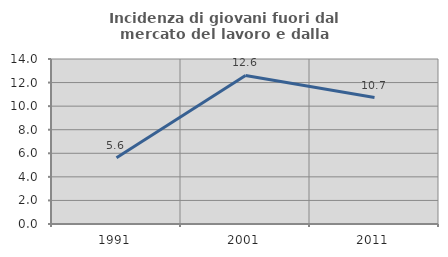
| Category | Incidenza di giovani fuori dal mercato del lavoro e dalla formazione  |
|---|---|
| 1991.0 | 5.621 |
| 2001.0 | 12.609 |
| 2011.0 | 10.732 |